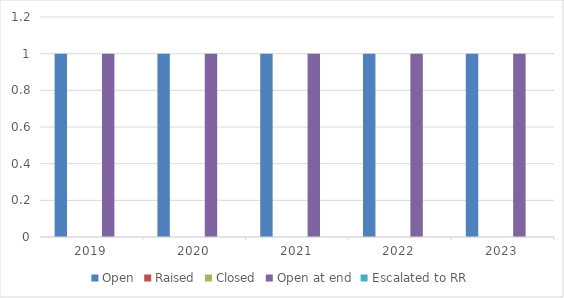
| Category | Open | Raised | Closed | Open at end | Escalated to RR |
|---|---|---|---|---|---|
| 2019-12-31 | 1 | 0 | 0 | 1 | 0 |
| 2020-12-31 | 1 | 0 | 0 | 1 | 0 |
| 2021-12-31 | 1 | 0 | 0 | 1 | 0 |
| 2022-12-31 | 1 | 0 | 0 | 1 | 0 |
| 2023-12-31 | 1 | 0 | 0 | 1 | 0 |